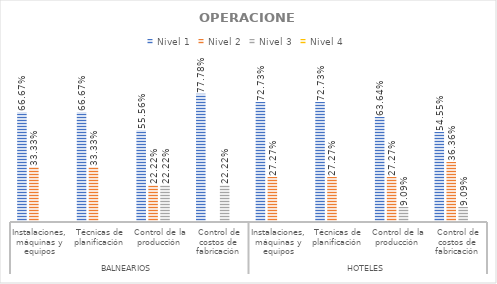
| Category | Nivel 1 | Nivel 2 | Nivel 3 | Nivel 4 |
|---|---|---|---|---|
| 0 | 0.667 | 0.333 | 0 | 0 |
| 1 | 0.667 | 0.333 | 0 | 0 |
| 2 | 0.556 | 0.222 | 0.222 | 0 |
| 3 | 0.778 | 0 | 0.222 | 0 |
| 4 | 0.727 | 0.273 | 0 | 0 |
| 5 | 0.727 | 0.273 | 0 | 0 |
| 6 | 0.636 | 0.273 | 0.091 | 0 |
| 7 | 0.545 | 0.364 | 0.091 | 0 |